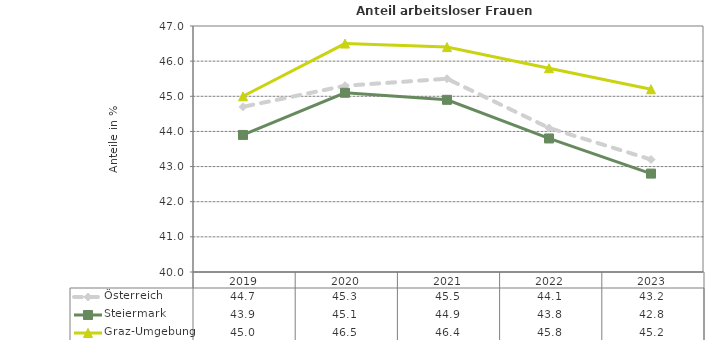
| Category | Österreich | Steiermark | Graz-Umgebung |
|---|---|---|---|
| 2023.0 | 43.2 | 42.8 | 45.2 |
| 2022.0 | 44.1 | 43.8 | 45.8 |
| 2021.0 | 45.5 | 44.9 | 46.4 |
| 2020.0 | 45.3 | 45.1 | 46.5 |
| 2019.0 | 44.7 | 43.9 | 45 |